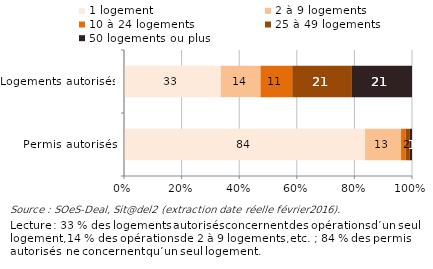
| Category | 1 logement | 2 à 9 logements | 10 à 24 logements | 25 à 49 logements | 50 logements ou plus |
|---|---|---|---|---|---|
| Permis autorisés | 2472 | 369 | 48 | 42 | 22 |
| Logements autorisés | 2472 | 1015 | 810 | 1524 | 1535 |